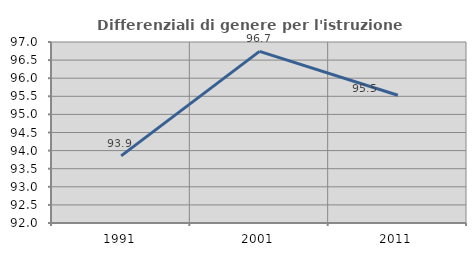
| Category | Differenziali di genere per l'istruzione superiore |
|---|---|
| 1991.0 | 93.853 |
| 2001.0 | 96.742 |
| 2011.0 | 95.529 |